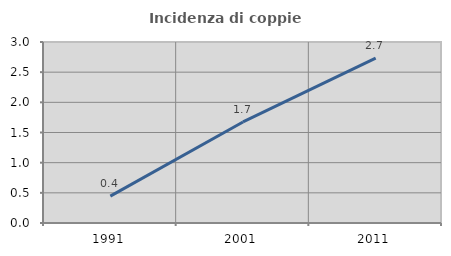
| Category | Incidenza di coppie miste |
|---|---|
| 1991.0 | 0.445 |
| 2001.0 | 1.675 |
| 2011.0 | 2.732 |